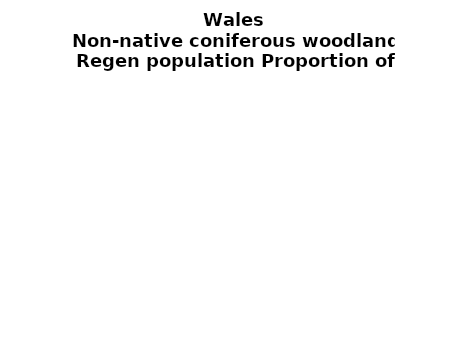
| Category | Non-native coniferous woodland |
|---|---|
| None | 0.081 |
| Seedlings only | 0 |
| Seedlings, saplings only | 0.037 |
| Seedlings, saplings, <7 cm trees | 0.157 |
| Saplings only | 0.173 |
| <7 cm trees, seedlings only | 0 |
| <7 cm trees, saplings only | 0.432 |
| <7 cm Trees only | 0.119 |